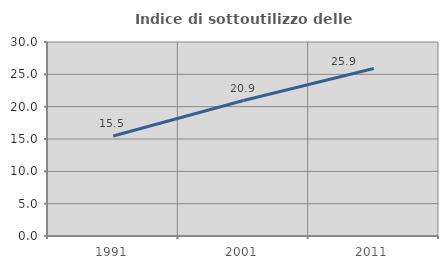
| Category | Indice di sottoutilizzo delle abitazioni  |
|---|---|
| 1991.0 | 15.475 |
| 2001.0 | 20.949 |
| 2011.0 | 25.913 |